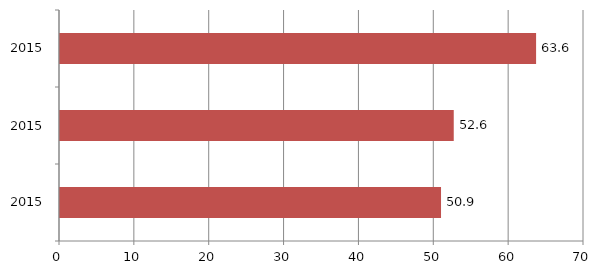
| Category | Series 0 |
|---|---|
| 2015.0 | 50.9 |
| 2015.0 | 52.6 |
| 2015.0 | 63.6 |